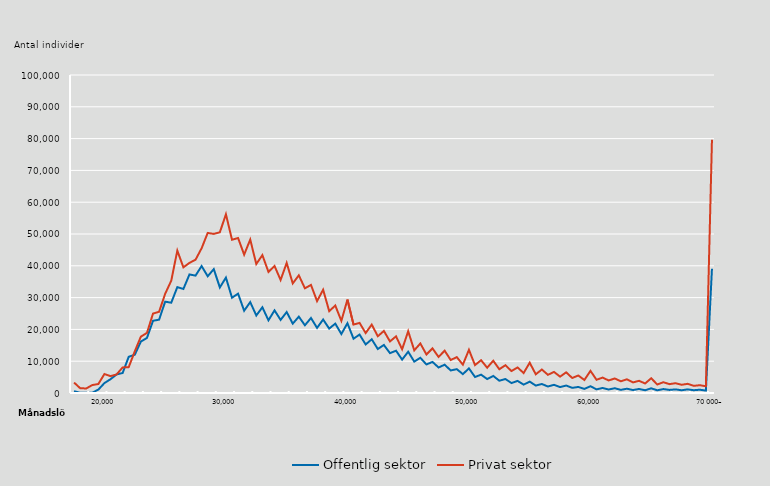
| Category | Offentlig sektor | Privat sektor |
|---|---|---|
|  | 563 | 3293 |
|  | 61 | 1519 |
|  | 50 | 1414 |
|  | 98 | 2496 |
|  | 1059 | 2826 |
| 20 000 | 3114 | 5965 |
|  | 4337 | 5304 |
|  | 5830 | 5829 |
|  | 6297 | 8045 |
|  | 11382 | 8131 |
|  | 12036 | 13108 |
|  | 16172 | 17724 |
|  | 17316 | 18902 |
|  | 22703 | 24973 |
|  | 23070 | 25545 |
|  | 28720 | 31204 |
|  | 28392 | 35308 |
|  | 33290 | 44777 |
|  | 32717 | 39516 |
|  | 37279 | 40922 |
|  | 36917 | 41916 |
|  | 39915 | 45527 |
|  | 36705 | 50330 |
|  | 38949 | 50032 |
|  | 33199 | 50544 |
| 30 000 | 36288 | 56214 |
|  | 29959 | 48195 |
|  | 31231 | 48740 |
|  | 25871 | 43508 |
|  | 28577 | 48235 |
|  | 24378 | 40566 |
|  | 26962 | 43352 |
|  | 22857 | 38079 |
|  | 25988 | 39947 |
|  | 22987 | 35543 |
|  | 25455 | 40899 |
|  | 21815 | 34464 |
|  | 24010 | 37002 |
|  | 21295 | 32922 |
|  | 23587 | 33984 |
|  | 20475 | 28900 |
|  | 23105 | 32468 |
|  | 20258 | 25728 |
|  | 21816 | 27502 |
|  | 18548 | 22686 |
| 40 000 | 21939 | 29369 |
|  | 17082 | 21522 |
|  | 18365 | 22043 |
|  | 15267 | 18849 |
|  | 16890 | 21506 |
|  | 13825 | 17849 |
|  | 15105 | 19519 |
|  | 12534 | 16217 |
|  | 13302 | 17813 |
|  | 10499 | 13756 |
|  | 12978 | 19412 |
|  | 9873 | 13408 |
|  | 11073 | 15578 |
|  | 8976 | 12123 |
|  | 9770 | 14030 |
|  | 8020 | 11336 |
|  | 8900 | 13310 |
|  | 7091 | 10370 |
|  | 7499 | 11282 |
|  | 5939 | 8920 |
| 50 000 | 7731 | 13573 |
|  | 5035 | 8784 |
|  | 5767 | 10308 |
|  | 4385 | 7957 |
|  | 5365 | 10145 |
|  | 3862 | 7474 |
|  | 4398 | 8729 |
|  | 3126 | 6902 |
|  | 3804 | 8032 |
|  | 2637 | 6276 |
|  | 3577 | 9529 |
|  | 2339 | 5883 |
|  | 2820 | 7387 |
|  | 2050 | 5715 |
|  | 2574 | 6627 |
|  | 1859 | 5144 |
|  | 2350 | 6499 |
|  | 1621 | 4721 |
|  | 1899 | 5504 |
|  | 1288 | 4095 |
| 60 000 | 2124 | 6965 |
|  | 1148 | 4158 |
|  | 1577 | 4846 |
|  | 1101 | 3943 |
|  | 1498 | 4568 |
|  | 990 | 3685 |
|  | 1349 | 4306 |
|  | 932 | 3328 |
|  | 1265 | 3831 |
|  | 865 | 2995 |
|  | 1473 | 4641 |
|  | 851 | 2668 |
|  | 1239 | 3396 |
|  | 970 | 2783 |
|  | 1140 | 3081 |
|  | 859 | 2589 |
|  | 1140 | 2883 |
|  | 879 | 2249 |
|  | 1030 | 2454 |
|  | 759 | 2121 |
| 70 000– | 39062 | 79627 |